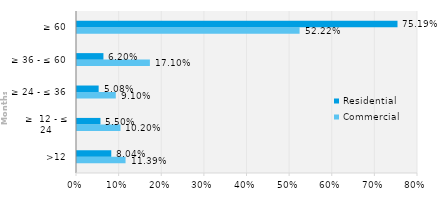
| Category | Commercial | Residential |
|---|---|---|
| >12 | 0.114 | 0.08 |
| ≥  12 - ≤ 24 | 0.102 | 0.055 |
| ≥ 24 - ≤ 36 | 0.091 | 0.051 |
| ≥ 36 - ≤ 60 | 0.171 | 0.062 |
| ≥ 60 | 0.522 | 0.752 |